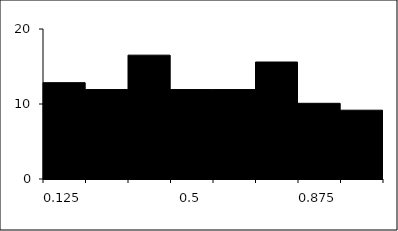
| Category | Series 1 |
|---|---|
| 0.125 | 12.844 |
| 0.25 | 11.927 |
| 0.375 | 16.514 |
| 0.5 | 11.927 |
| 0.625 | 11.927 |
| 0.75 | 15.596 |
| 0.875 | 10.092 |
| 1.0 | 9.174 |